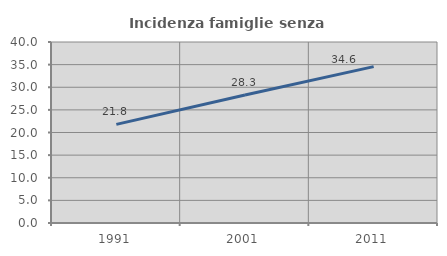
| Category | Incidenza famiglie senza nuclei |
|---|---|
| 1991.0 | 21.797 |
| 2001.0 | 28.289 |
| 2011.0 | 34.563 |